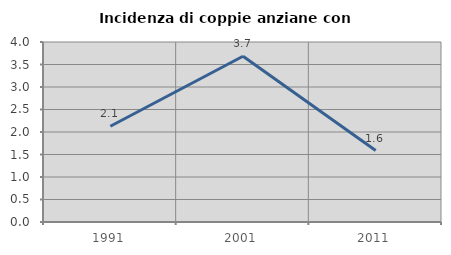
| Category | Incidenza di coppie anziane con figli |
|---|---|
| 1991.0 | 2.128 |
| 2001.0 | 3.684 |
| 2011.0 | 1.587 |